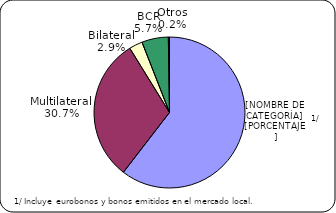
| Category | Series 0 |
|---|---|
| Inversionistas | 7491.6 |
| Multilateral | 3809.1 |
| Bilateral | 356.4 |
| BCR | 704.3 |
| Otros | 30.6 |